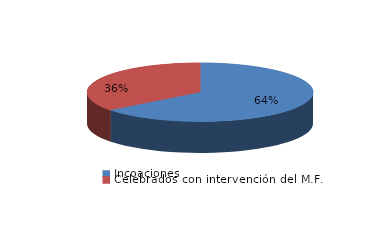
| Category | Series 0 |
|---|---|
| Incoaciones | 3087 |
| Celebrados con intervención del M.F. | 1702 |